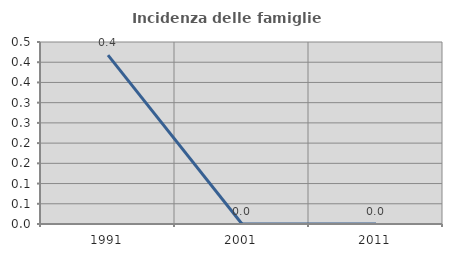
| Category | Incidenza delle famiglie numerose |
|---|---|
| 1991.0 | 0.418 |
| 2001.0 | 0 |
| 2011.0 | 0 |